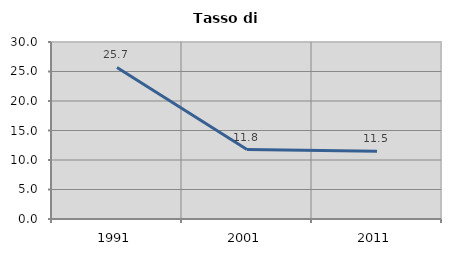
| Category | Tasso di disoccupazione   |
|---|---|
| 1991.0 | 25.683 |
| 2001.0 | 11.765 |
| 2011.0 | 11.486 |